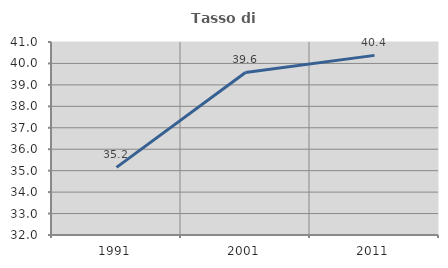
| Category | Tasso di occupazione   |
|---|---|
| 1991.0 | 35.153 |
| 2001.0 | 39.578 |
| 2011.0 | 40.377 |